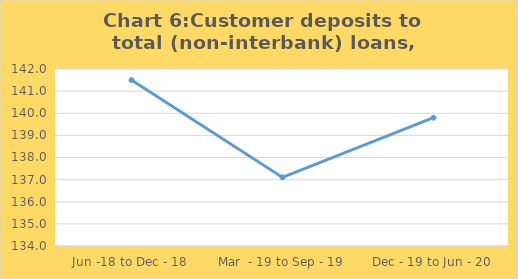
| Category | Customer deposits to total (non-interbank) loans |
|---|---|
| Jun -18 to Dec - 18 | 141.5 |
| Mar  - 19 to Sep - 19 | 137.1 |
| Dec - 19 to Jun - 20 | 139.8 |